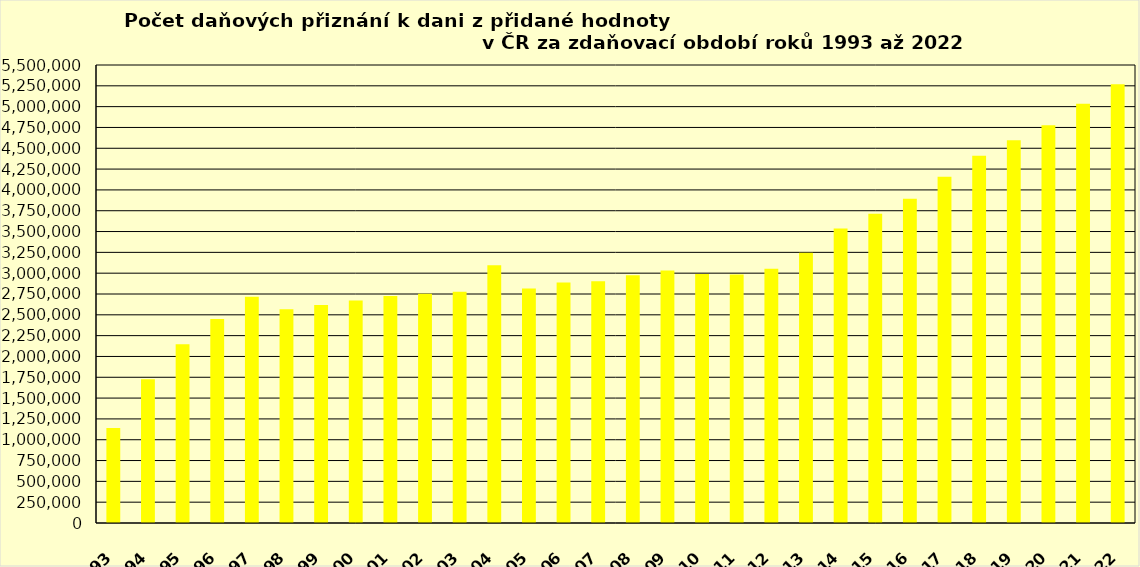
| Category | Series 0 |
|---|---|
| 1993 | 1140755 |
| 1994 | 1727290 |
| 1995 | 2147169 |
| 1996 | 2448436 |
| 1997 | 2716250 |
| 1998 | 2568304 |
| 1999 | 2617628 |
| 2000 | 2673355 |
| 2001 | 2727115 |
| 2002 | 2753616 |
| 2003 | 2776783 |
| 2004 | 3094611 |
| 2005 | 2816384 |
| 2006 | 2887845 |
| 2007 | 2902614 |
| 2008 | 2975122 |
| 2009 | 3030894 |
| 2010 | 2990251 |
| 2011 | 2985376 |
| 2012 | 3053582 |
| 2013 | 3245327 |
| 2014 | 3536745 |
| 2015 | 3713114 |
| 2016 | 3893417 |
| 2017 | 4159067 |
| 2018 | 4411443 |
| 2019 | 4597235 |
| 2020 | 4776428 |
| 2021 | 5034447 |
| 2022 | 5267554 |